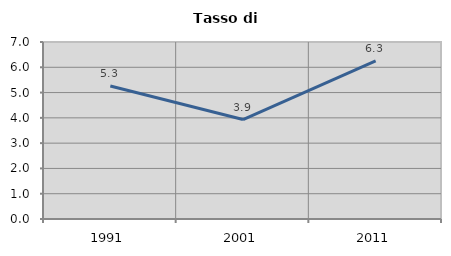
| Category | Tasso di disoccupazione   |
|---|---|
| 1991.0 | 5.258 |
| 2001.0 | 3.932 |
| 2011.0 | 6.254 |